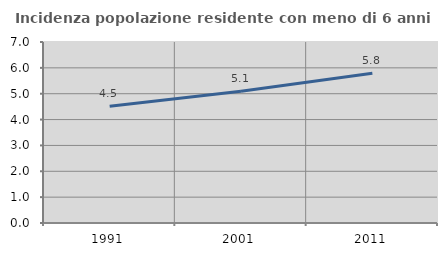
| Category | Incidenza popolazione residente con meno di 6 anni |
|---|---|
| 1991.0 | 4.514 |
| 2001.0 | 5.097 |
| 2011.0 | 5.795 |